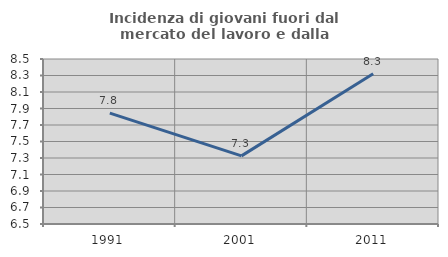
| Category | Incidenza di giovani fuori dal mercato del lavoro e dalla formazione  |
|---|---|
| 1991.0 | 7.845 |
| 2001.0 | 7.326 |
| 2011.0 | 8.32 |